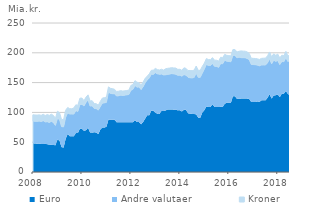
| Category | Euro | Andre valutaer | Kroner |
|---|---|---|---|
| 2008 | 48.212 | 37.301 | 10.453 |
| 2008 | 47.826 | 37.374 | 10.453 |
| 2008 | 47.439 | 37.561 | 10.453 |
| 2008 | 47.686 | 37.797 | 10.453 |
| 2008 | 46.932 | 37.656 | 10.453 |
| 2008 | 47.059 | 39.051 | 10.803 |
| 2008 | 47.225 | 36.689 | 10.803 |
| 2008 | 46.563 | 37.837 | 12.016 |
| 2008 | 45.957 | 37.083 | 12.016 |
| 2008 | 45.663 | 39.431 | 11.884 |
| 2008 | 45.278 | 37.825 | 11.884 |
| 2008 | 44.909 | 33.194 | 11.831 |
| 2009 | 54.511 | 35.452 | 11.97 |
| 2009 | 52.475 | 35.649 | 11.47 |
| 2009 | 41.791 | 34.361 | 11.904 |
| 2009 | 40.93 | 34.843 | 12.117 |
| 2009 | 55.637 | 35.871 | 12.167 |
| 2009 | 63.854 | 35.45 | 8.92 |
| 2009 | 60.143 | 37.144 | 8.92 |
| 2009 | 59.871 | 37.336 | 8.92 |
| 2009 | 59.898 | 37.21 | 10.363 |
| 2009 | 65.406 | 37.545 | 9.761 |
| 2009 | 65.327 | 36.289 | 10.341 |
| 2009 | 72.78 | 40.349 | 10.689 |
| 2010 | 72.232 | 41.324 | 10.544 |
| 2010 | 68.96 | 41.743 | 8.939 |
| 2010 | 70.093 | 46.675 | 8.942 |
| 2010 | 74.278 | 46.558 | 8.607 |
| 2010 | 66.213 | 44.329 | 8.608 |
| 2010 | 66.054 | 45.028 | 8.573 |
| 2010 | 66.766 | 39.869 | 8.289 |
| 2010 | 66.235 | 40.063 | 8.287 |
| 2010 | 63.541 | 40.235 | 8.247 |
| 2010 | 71.071 | 38.72 | 8.673 |
| 2010 | 74.602 | 40.775 | 8.648 |
| 2010 | 74.453 | 41.526 | 8.735 |
| 2011 | 75.884 | 40.973 | 8.729 |
| 2011 | 87.835 | 46.231 | 8.729 |
| 2011 | 87.577 | 44.264 | 8.541 |
| 2011 | 87.588 | 43.741 | 8.499 |
| 2011 | 87.57 | 43.63 | 7.499 |
| 2011 | 83.64 | 43.792 | 7.669 |
| 2011 | 83.594 | 44.347 | 7.669 |
| 2011 | 83.615 | 45.364 | 7.555 |
| 2011 | 83.508 | 44.922 | 7.385 |
| 2011 | 83.511 | 45.43 | 7.356 |
| 2011 | 83.455 | 45.994 | 7.331 |
| 2011 | 83.424 | 46.641 | 7.24 |
| 2012 | 83.511 | 53.593 | 8.238 |
| 2012 | 83.522 | 55.146 | 8.114 |
| 2012 | 87.249 | 57.758 | 8.265 |
| 2012 | 83.834 | 58.522 | 8.265 |
| 2012 | 83.756 | 58.813 | 7.295 |
| 2012 | 80.056 | 58.26 | 7.738 |
| 2012 | 83.938 | 59.341 | 7.738 |
| 2012 | 89.646 | 59.99 | 7.738 |
| 2012 | 95.288 | 59.203 | 6.266 |
| 2012 | 95.343 | 62.211 | 7.016 |
| 2012 | 102.805 | 61.148 | 6.667 |
| 2012 | 102.811 | 60.978 | 7.102 |
| 2013 | 99.548 | 67.068 | 7.201 |
| 2013 | 97.614 | 67.01 | 7.18 |
| 2013 | 97.279 | 66.798 | 7.072 |
| 2013 | 102.54 | 61.766 | 8.072 |
| 2013 | 102.424 | 60.415 | 8.143 |
| 2013 | 103.141 | 59.938 | 10.143 |
| 2013 | 104.87 | 58.929 | 10.143 |
| 2013 | 104.813 | 59.454 | 10.143 |
| 2013 | 104.794 | 60.319 | 9.978 |
| 2013 | 104.587 | 59.992 | 9.978 |
| 2013 | 104.589 | 59.386 | 10.457 |
| 2013 | 103.392 | 58.899 | 9.969 |
| 2014 | 103.417 | 59.042 | 9.904 |
| 2014 | 101.559 | 59.181 | 9.888 |
| 2014 | 104.444 | 59.008 | 11.367 |
| 2014 | 104.418 | 58.072 | 11.367 |
| 2014 | 98.544 | 60.453 | 11.21 |
| 2014 | 97.839 | 60.287 | 12.186 |
| 2014 | 97.371 | 60.413 | 12.186 |
| 2014 | 97.313 | 61.393 | 12.185 |
| 2014 | 96.729 | 69.336 | 11.742 |
| 2014 | 91.172 | 67.67 | 11.748 |
| 2014 | 91.129 | 67.767 | 11.747 |
| 2014 | 99.488 | 66.225 | 11.452 |
| 2015 | 103.823 | 68.893 | 9.948 |
| 2015 | 109.905 | 70.442 | 9.948 |
| 2015 | 109.245 | 69.504 | 9.948 |
| 2015 | 109.132 | 69.575 | 9.752 |
| 2015 | 113.582 | 68.341 | 9.952 |
| 2015 | 109.117 | 68.197 | 10.327 |
| 2015 | 109.133 | 68.014 | 10.427 |
| 2015 | 109.154 | 66.416 | 10.427 |
| 2015 | 109.285 | 72.706 | 10.566 |
| 2015 | 109.256 | 72.269 | 10.346 |
| 2015 | 114.515 | 73.083 | 9.862 |
| 2015 | 116.237 | 69.663 | 9.821 |
| 2016 | 116.237 | 69.299 | 9.85 |
| 2016 | 115.906 | 68.976 | 9.87 |
| 2016 | 127.228 | 68.322 | 9.855 |
| 2016 | 127.122 | 68.633 | 9.826 |
| 2016 | 122.813 | 68.771 | 9.803 |
| 2016 | 122.84 | 69.886 | 9.803 |
| 2016 | 123.113 | 68.733 | 11.391 |
| 2016 | 123.213 | 68.564 | 11.016 |
| 2016 | 123.343 | 68.374 | 10.976 |
| 2016 | 123.139 | 67.293 | 10.969 |
| 2016 | 122.549 | 66.089 | 10.424 |
| 2016 | 117.568 | 62.898 | 10.424 |
| 2017 | 117.614 | 62.663 | 10.417 |
| 2017 | 117.252 | 62.772 | 10.417 |
| 2017 | 118.483 | 60.837 | 10.594 |
| 2017 | 117.606 | 60.517 | 10.749 |
| 2017 | 120.235 | 59.266 | 11.137 |
| 2017 | 120.183 | 59.338 | 11.432 |
| 2017 | 120.275 | 59.188 | 11.53 |
| 2017 | 124.769 | 58.599 | 11.71 |
| 2017 | 130.649 | 59.328 | 11.49 |
| 2017 | 123.111 | 58.275 | 11.826 |
| 2017 | 128.338 | 59.363 | 10.626 |
| 2017 | 128.772 | 56.784 | 10.28 |
| 2018 | 130.026 | 57.007 | 10.815 |
| 2018 | 125.633 | 54.603 | 11.264 |
| 2018 | 131.477 | 53.99 | 10.564 |
| 2018 | 131.476 | 53.638 | 10.063 |
| 2018 | 136.047 | 55.76 | 10.613 |
| 2018 | 130.753 | 54.365 | 9.292 |
| 2018 | 128.836 | 59.318 | 9.284 |